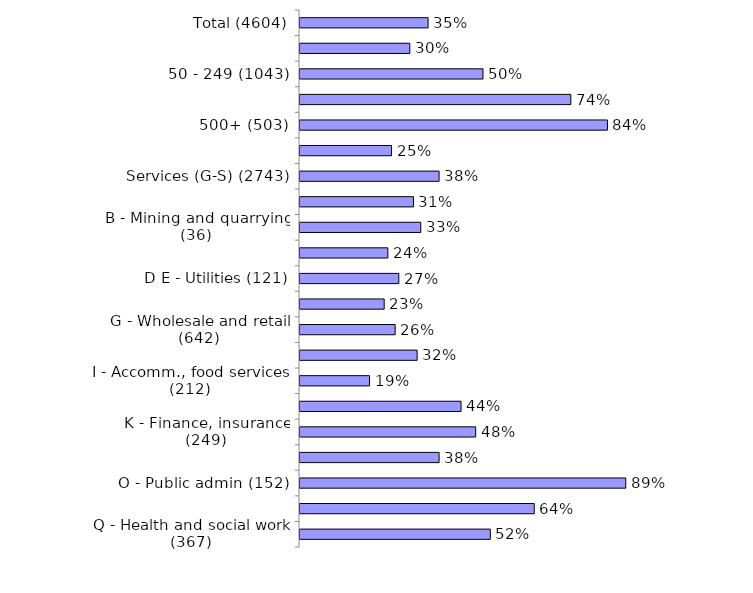
| Category | Yes |
|---|---|
| Total (4604) | 0.35 |
| 10-49 (2678) | 0.3 |
| 50 - 249 (1043) | 0.5 |
| 250 - 499 (380) | 0.74 |
| 500+ (503) | 0.84 |
| Production (A-F) (1861) | 0.25 |
| Services (G-S) (2743) | 0.38 |
| A - Agriculture (135) | 0.31 |
| B - Mining and quarrying (36) | 0.33 |
| C - Manufacturing (1396) | 0.24 |
| D E - Utilities (121) | 0.27 |
| F - Construction (173) | 0.23 |
| G - Wholesale and retail (642) | 0.26 |
| H - Transport , storage (203) | 0.32 |
| I - Accomm., food services (212) | 0.19 |
| J - Information, comms (170) | 0.44 |
| K - Finance, insurance (249) | 0.48 |
| LMNRS - Bus/tech/admin/arts/other (366) | 0.38 |
| O - Public admin (152) | 0.89 |
| P - Education (382) | 0.64 |
| Q - Health and social work (367) | 0.52 |